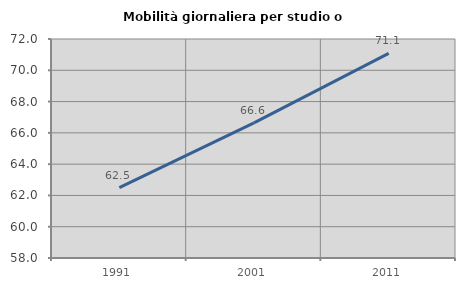
| Category | Mobilità giornaliera per studio o lavoro |
|---|---|
| 1991.0 | 62.5 |
| 2001.0 | 66.642 |
| 2011.0 | 71.077 |